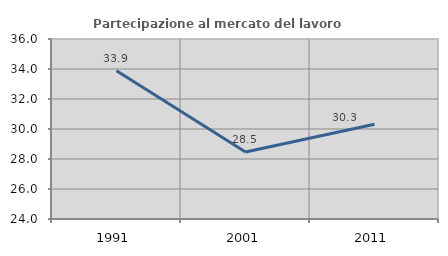
| Category | Partecipazione al mercato del lavoro  femminile |
|---|---|
| 1991.0 | 33.887 |
| 2001.0 | 28.467 |
| 2011.0 | 30.312 |